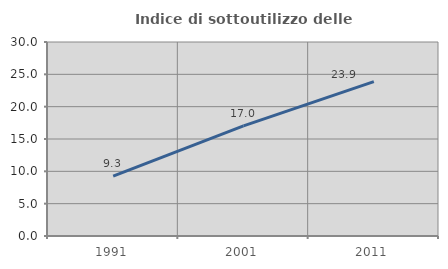
| Category | Indice di sottoutilizzo delle abitazioni  |
|---|---|
| 1991.0 | 9.254 |
| 2001.0 | 17.037 |
| 2011.0 | 23.875 |